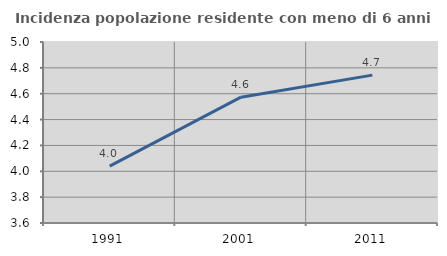
| Category | Incidenza popolazione residente con meno di 6 anni |
|---|---|
| 1991.0 | 4.04 |
| 2001.0 | 4.573 |
| 2011.0 | 4.744 |